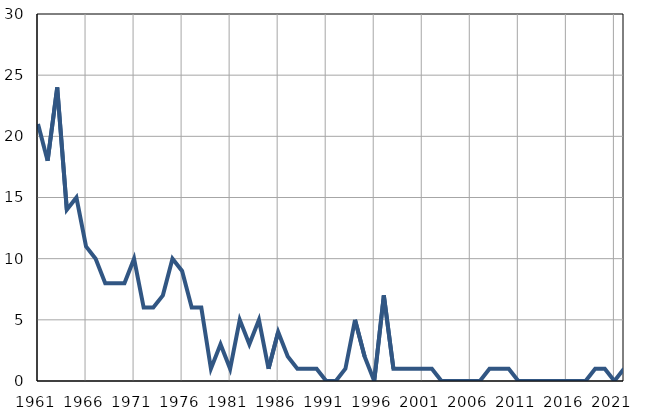
| Category | Infants
deaths |
|---|---|
| 1961.0 | 21 |
| 1962.0 | 18 |
| 1963.0 | 24 |
| 1964.0 | 14 |
| 1965.0 | 15 |
| 1966.0 | 11 |
| 1967.0 | 10 |
| 1968.0 | 8 |
| 1969.0 | 8 |
| 1970.0 | 8 |
| 1971.0 | 10 |
| 1972.0 | 6 |
| 1973.0 | 6 |
| 1974.0 | 7 |
| 1975.0 | 10 |
| 1976.0 | 9 |
| 1977.0 | 6 |
| 1978.0 | 6 |
| 1979.0 | 1 |
| 1980.0 | 3 |
| 1981.0 | 1 |
| 1982.0 | 5 |
| 1983.0 | 3 |
| 1984.0 | 5 |
| 1985.0 | 1 |
| 1986.0 | 4 |
| 1987.0 | 2 |
| 1988.0 | 1 |
| 1989.0 | 1 |
| 1990.0 | 1 |
| 1991.0 | 0 |
| 1992.0 | 0 |
| 1993.0 | 1 |
| 1994.0 | 5 |
| 1995.0 | 2 |
| 1996.0 | 0 |
| 1997.0 | 7 |
| 1998.0 | 1 |
| 1999.0 | 1 |
| 2000.0 | 1 |
| 2001.0 | 1 |
| 2002.0 | 1 |
| 2003.0 | 0 |
| 2004.0 | 0 |
| 2005.0 | 0 |
| 2006.0 | 0 |
| 2007.0 | 0 |
| 2008.0 | 1 |
| 2009.0 | 1 |
| 2010.0 | 1 |
| 2011.0 | 0 |
| 2012.0 | 0 |
| 2013.0 | 0 |
| 2014.0 | 0 |
| 2015.0 | 0 |
| 2016.0 | 0 |
| 2017.0 | 0 |
| 2018.0 | 0 |
| 2019.0 | 1 |
| 2020.0 | 1 |
| 2021.0 | 0 |
| 2022.0 | 1 |